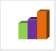
| Category | област Плевен |
|---|---|
| летен сезон 2019  | 26380 |
| летен сезон 2021  | 32479 |
| летен сезон 2022 г.  | 45070 |